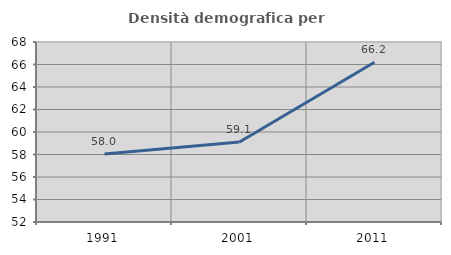
| Category | Densità demografica |
|---|---|
| 1991.0 | 58.046 |
| 2001.0 | 59.112 |
| 2011.0 | 66.198 |